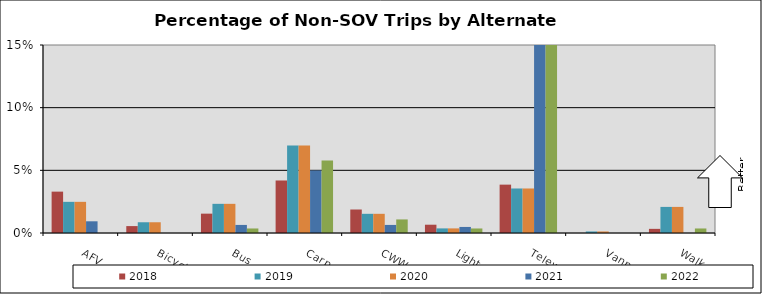
| Category | 2018 | 2019 | 2020 | 2021 | 2022 |
|---|---|---|---|---|---|
| AFV | 0.033 | 0.025 | 0.025 | 0.009 | 0 |
| Bicycle | 0.006 | 0.009 | 0.009 | 0 | 0 |
| Bus | 0.015 | 0.023 | 0.023 | 0.006 | 0.004 |
| Carpool | 0.042 | 0.07 | 0.07 | 0.05 | 0.058 |
| CWW | 0.019 | 0.015 | 0.015 | 0.006 | 0.011 |
| Light Rail | 0.007 | 0.004 | 0.004 | 0.005 | 0.004 |
| Telework | 0.039 | 0.036 | 0.036 | 0.514 | 0.59 |
| Vanpool | 0 | 0.001 | 0.001 | 0 | 0 |
| Walk | 0.003 | 0.021 | 0.021 | 0 | 0.004 |